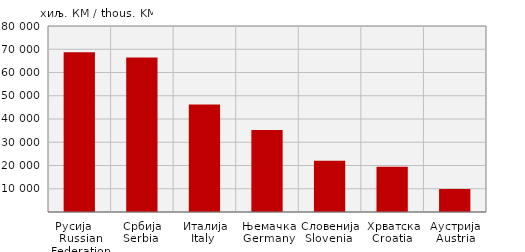
| Category | Увоз
Import |
|---|---|
| Русија     Russian Federation | 68728 |
| Србија
Serbia  | 66404 |
| Италија
Italy  | 46248 |
| Њемачка
Germany | 35237 |
| Словенија
Slovenia  | 22095 |
| Хрватска
Croatia  | 19501 |
| Аустрија
Austria | 9886 |